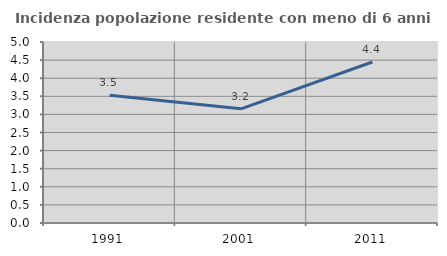
| Category | Incidenza popolazione residente con meno di 6 anni |
|---|---|
| 1991.0 | 3.529 |
| 2001.0 | 3.155 |
| 2011.0 | 4.448 |